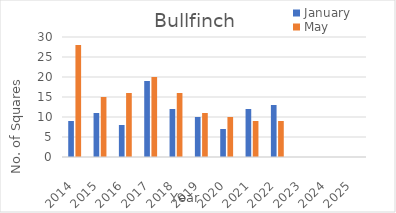
| Category | January | May |
|---|---|---|
| 2014.0 | 9 | 28 |
| 2015.0 | 11 | 15 |
| 2016.0 | 8 | 16 |
| 2017.0 | 19 | 20 |
| 2018.0 | 12 | 16 |
| 2019.0 | 10 | 11 |
| 2020.0 | 7 | 10 |
| 2021.0 | 12 | 9 |
| 2022.0 | 13 | 9 |
| 2023.0 | 0 | 0 |
| 2024.0 | 0 | 0 |
| 2025.0 | 0 | 0 |